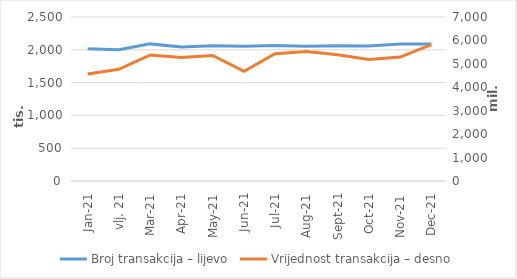
| Category | Broj transakcija – lijevo |
|---|---|
| sij.21 | 2017651 |
| vlj. 21 | 1999480 |
| ožu.21 | 2090122 |
| tra.21 | 2044053 |
| svi.21 | 2062167 |
| lip.21 | 2054069 |
| srp.21 | 2065147 |
| kol.21 | 2052495 |
| ruj.21 | 2062074 |
| lis.21 | 2057133 |
| stu.21 | 2087971 |
| pro.21 | 2088273 |